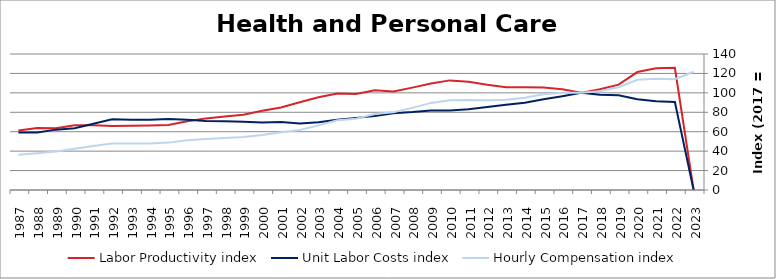
| Category | Labor Productivity index | Unit Labor Costs index | Hourly Compensation index |
|---|---|---|---|
| 2023.0 | 0 | 0 | 121.691 |
| 2022.0 | 125.867 | 90.549 | 113.972 |
| 2021.0 | 125.432 | 91.309 | 114.53 |
| 2020.0 | 121.417 | 93.499 | 113.524 |
| 2019.0 | 108.495 | 97.487 | 105.769 |
| 2018.0 | 103.701 | 98.005 | 101.632 |
| 2017.0 | 100 | 100 | 100 |
| 2016.0 | 103.628 | 96.619 | 100.125 |
| 2015.0 | 105.427 | 93.478 | 98.551 |
| 2014.0 | 105.816 | 89.838 | 95.063 |
| 2013.0 | 105.821 | 87.729 | 92.836 |
| 2012.0 | 108.279 | 85.441 | 92.514 |
| 2011.0 | 111.457 | 83.166 | 92.694 |
| 2010.0 | 112.843 | 81.869 | 92.383 |
| 2009.0 | 109.679 | 81.751 | 89.663 |
| 2008.0 | 105.392 | 80.193 | 84.517 |
| 2007.0 | 101.299 | 79.117 | 80.145 |
| 2006.0 | 102.672 | 76.165 | 78.2 |
| 2005.0 | 98.909 | 74.242 | 73.431 |
| 2004.0 | 99.376 | 72.237 | 71.787 |
| 2003.0 | 95.396 | 69.719 | 66.509 |
| 2002.0 | 90.354 | 68.433 | 61.832 |
| 2001.0 | 85.014 | 70.022 | 59.529 |
| 2000.0 | 81.535 | 69.566 | 56.721 |
| 1999.0 | 77.56 | 70.314 | 54.536 |
| 1998.0 | 75.626 | 70.781 | 53.529 |
| 1997.0 | 73.726 | 71.155 | 52.46 |
| 1996.0 | 70.795 | 72.35 | 51.22 |
| 1995.0 | 66.842 | 72.965 | 48.771 |
| 1994.0 | 66.324 | 72.342 | 47.98 |
| 1993.0 | 66.126 | 72.439 | 47.9 |
| 1992.0 | 65.796 | 72.716 | 47.844 |
| 1991.0 | 66.555 | 68.154 | 45.36 |
| 1990.0 | 66.719 | 63.566 | 42.41 |
| 1989.0 | 63.618 | 62.143 | 39.534 |
| 1988.0 | 63.766 | 59.305 | 37.816 |
| 1987.0 | 61.266 | 59.068 | 36.188 |